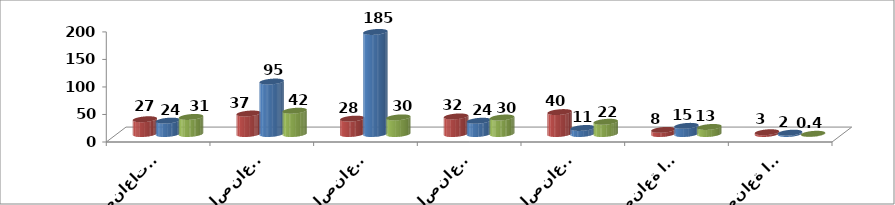
| Category | جانفي 2014 | جانفي 2013 | جانفي 2010 |
|---|---|---|---|
| صناعات مواد البناء والخزف والبلور | 26.8 | 24.3 | 31 |
| الصناعات الغذائية | 37.2 | 95.3 | 42.3 |
| الصناعات الميكانيكية والكهربائية | 27.9 | 185.4 | 30.2 |
| الصناعات المختلفة | 31.9 | 24.1 | 29.9 |
| الصناعات الكيميائية | 39.8 | 11 | 22.2 |
| صناعة النسيج والملابس | 7.5 | 14.8 | 12.8 |
| صناعة الجلود والاحذية | 3.2 | 2.4 | 0.4 |